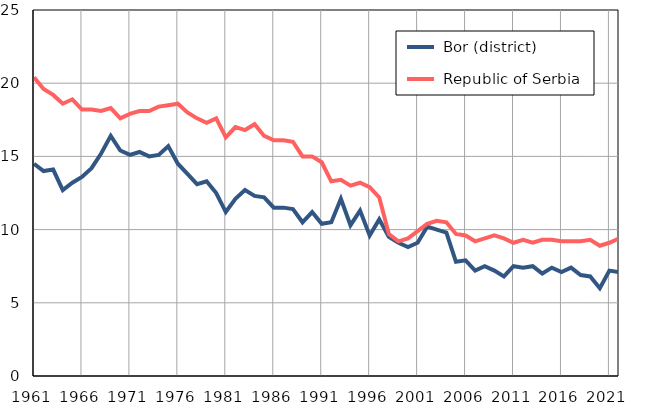
| Category |  Bor (district) |  Republic of Serbia |
|---|---|---|
| 1961.0 | 14.5 | 20.4 |
| 1962.0 | 14 | 19.6 |
| 1963.0 | 14.1 | 19.2 |
| 1964.0 | 12.7 | 18.6 |
| 1965.0 | 13.2 | 18.9 |
| 1966.0 | 13.6 | 18.2 |
| 1967.0 | 14.2 | 18.2 |
| 1968.0 | 15.2 | 18.1 |
| 1969.0 | 16.4 | 18.3 |
| 1970.0 | 15.4 | 17.6 |
| 1971.0 | 15.1 | 17.9 |
| 1972.0 | 15.3 | 18.1 |
| 1973.0 | 15 | 18.1 |
| 1974.0 | 15.1 | 18.4 |
| 1975.0 | 15.7 | 18.5 |
| 1976.0 | 14.5 | 18.6 |
| 1977.0 | 13.8 | 18 |
| 1978.0 | 13.1 | 17.6 |
| 1979.0 | 13.3 | 17.3 |
| 1980.0 | 12.5 | 17.6 |
| 1981.0 | 11.2 | 16.3 |
| 1982.0 | 12.1 | 17 |
| 1983.0 | 12.7 | 16.8 |
| 1984.0 | 12.3 | 17.2 |
| 1985.0 | 12.2 | 16.4 |
| 1986.0 | 11.5 | 16.1 |
| 1987.0 | 11.5 | 16.1 |
| 1988.0 | 11.4 | 16 |
| 1989.0 | 10.5 | 15 |
| 1990.0 | 11.2 | 15 |
| 1991.0 | 10.4 | 14.6 |
| 1992.0 | 10.5 | 13.3 |
| 1993.0 | 12.1 | 13.4 |
| 1994.0 | 10.3 | 13 |
| 1995.0 | 11.3 | 13.2 |
| 1996.0 | 9.6 | 12.9 |
| 1997.0 | 10.7 | 12.2 |
| 1998.0 | 9.5 | 9.7 |
| 1999.0 | 9.1 | 9.2 |
| 2000.0 | 8.8 | 9.4 |
| 2001.0 | 9.1 | 9.9 |
| 2002.0 | 10.2 | 10.4 |
| 2003.0 | 10 | 10.6 |
| 2004.0 | 9.8 | 10.5 |
| 2005.0 | 7.8 | 9.7 |
| 2006.0 | 7.9 | 9.6 |
| 2007.0 | 7.2 | 9.2 |
| 2008.0 | 7.5 | 9.4 |
| 2009.0 | 7.2 | 9.6 |
| 2010.0 | 6.8 | 9.4 |
| 2011.0 | 7.5 | 9.1 |
| 2012.0 | 7.4 | 9.3 |
| 2013.0 | 7.5 | 9.1 |
| 2014.0 | 7 | 9.3 |
| 2015.0 | 7.4 | 9.3 |
| 2016.0 | 7.1 | 9.2 |
| 2017.0 | 7.4 | 9.2 |
| 2018.0 | 6.9 | 9.2 |
| 2019.0 | 6.8 | 9.3 |
| 2020.0 | 6 | 8.9 |
| 2021.0 | 7.2 | 9.1 |
| 2022.0 | 7.1 | 9.4 |